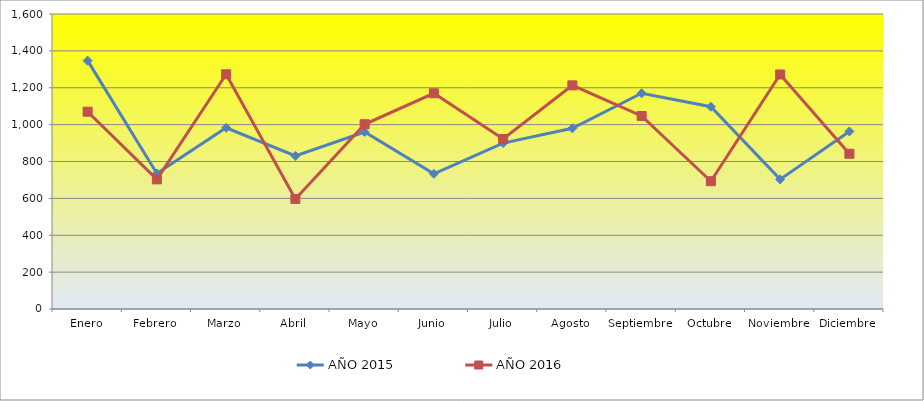
| Category | AÑO 2015 | AÑO 2016 |
|---|---|---|
| Enero | 1347 | 1070 |
| Febrero | 735 | 703 |
| Marzo | 983 | 1273 |
| Abril | 830 | 597 |
| Mayo | 960 | 1002 |
| Junio | 733 | 1170 |
| Julio | 900 | 922 |
| Agosto | 980 | 1213 |
| Septiembre | 1170 | 1047 |
| Octubre | 1097 | 693 |
| Noviembre | 703 | 1272 |
| Diciembre | 963 | 842 |